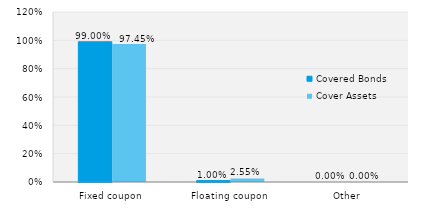
| Category | Covered Bonds | Cover Assets |
|---|---|---|
| Fixed coupon | 0.99 | 0.974 |
| Floating coupon | 0.01 | 0.026 |
| Other | 0 | 0 |